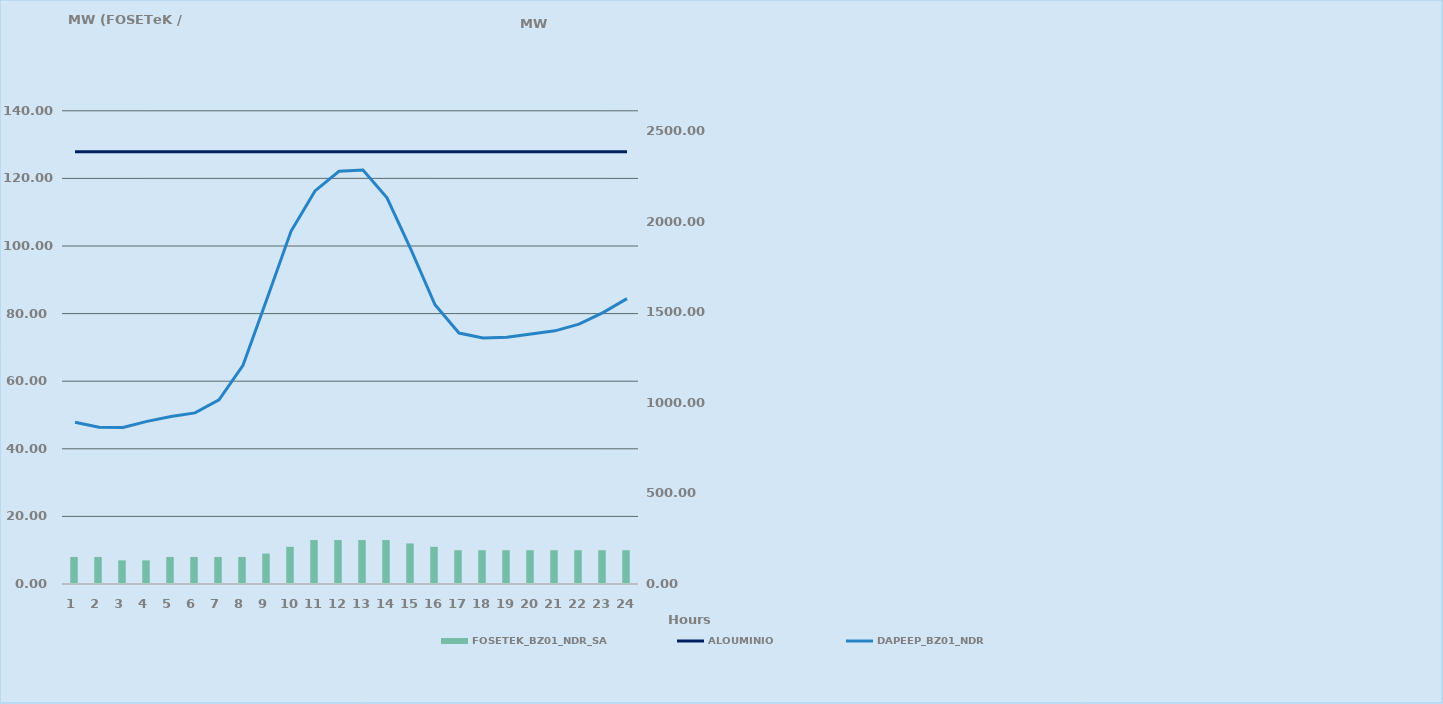
| Category | FOSETEK_BZ01_NDR_SA |
|---|---|
| 0 | 8 |
| 1 | 8 |
| 2 | 7 |
| 3 | 7 |
| 4 | 8 |
| 5 | 8 |
| 6 | 8 |
| 7 | 8 |
| 8 | 9 |
| 9 | 11 |
| 10 | 13 |
| 11 | 13 |
| 12 | 13 |
| 13 | 13 |
| 14 | 12 |
| 15 | 11 |
| 16 | 10 |
| 17 | 10 |
| 18 | 10 |
| 19 | 10 |
| 20 | 10 |
| 21 | 10 |
| 22 | 10 |
| 23 | 10 |